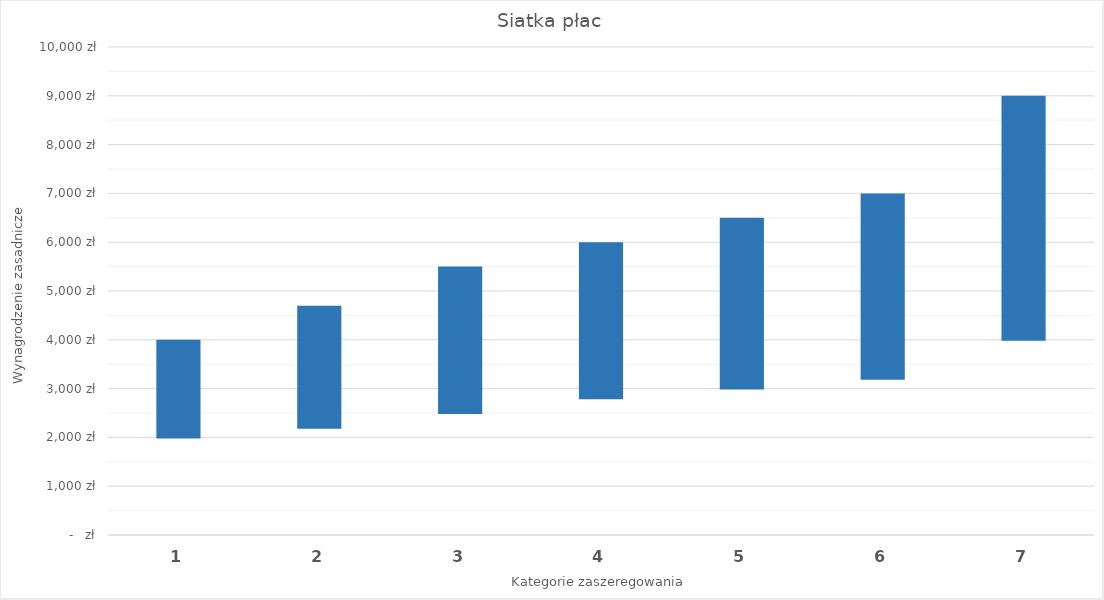
| Category | Series 1 | Poziom doświadczenia I |
|---|---|---|
| 0 | 2000 | 2000 |
| 1 | 2200 | 2500 |
| 2 | 2500 | 3000 |
| 3 | 2800 | 3200 |
| 4 | 3000 | 3500 |
| 5 | 3200 | 3800 |
| 6 | 4000 | 5000 |